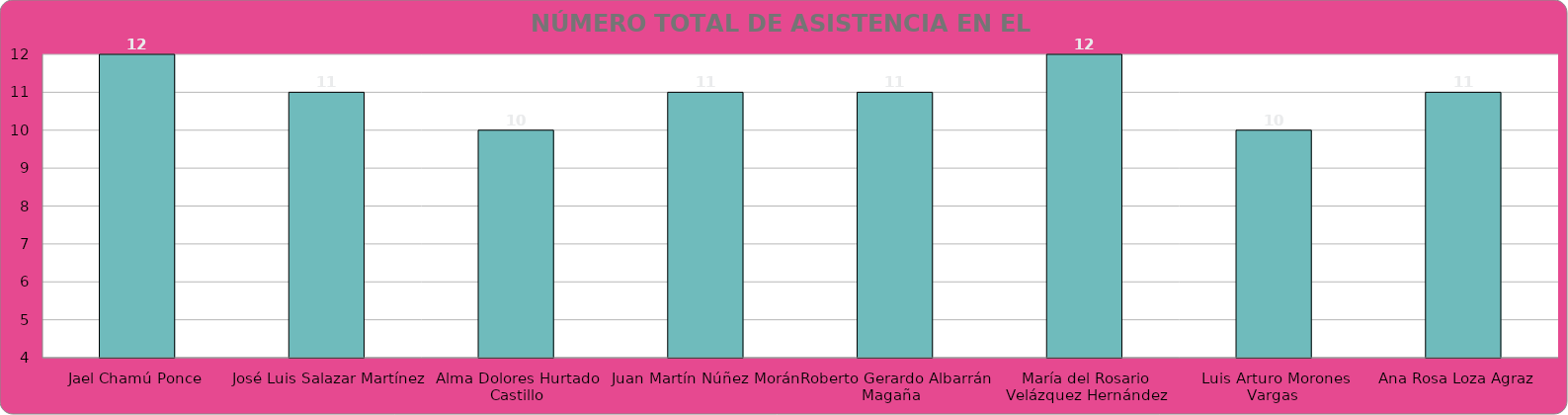
| Category | Jael Chamú Ponce José Luis Salazar Martínez  Alma Dolores Hurtado Castillo Juan Martín Núñez Morán Roberto Gerardo Albarrán Magaña   María del Rosario Velázquez Hernández Luis Arturo Morones Vargas  Ana Rosa Loza Agraz    Regidores |
|---|---|
| Jael Chamú Ponce | 12 |
| José Luis Salazar Martínez  | 11 |
| Alma Dolores Hurtado Castillo | 10 |
| Juan Martín Núñez Morán | 11 |
| Roberto Gerardo Albarrán Magaña   | 11 |
| María del Rosario Velázquez Hernández | 12 |
| Luis Arturo Morones Vargas  | 10 |
| Ana Rosa Loza Agraz    | 11 |